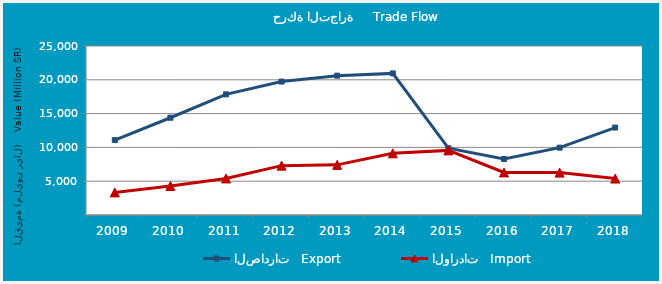
| Category | الصادرات   Export | الواردات   Import |
|---|---|---|
| 2009.0 | 11079476058 | 3342012668 |
| 2010.0 | 14388470196 | 4291027767 |
| 2011.0 | 17846864290 | 5407056473 |
| 2012.0 | 19738543102 | 7301227014 |
| 2013.0 | 20614564724 | 7416955679 |
| 2014.0 | 20948701581 | 9126303700 |
| 2015.0 | 9879512691 | 9559237783 |
| 2016.0 | 8285189736 | 6295803665 |
| 2017.0 | 9962955402 | 6272087676 |
| 2018.0 | 12937998615 | 5387968638 |